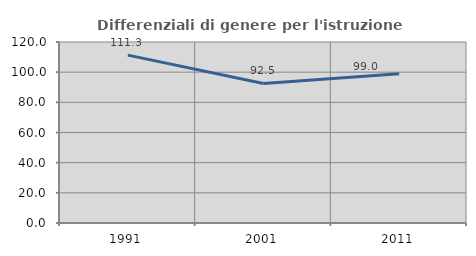
| Category | Differenziali di genere per l'istruzione superiore |
|---|---|
| 1991.0 | 111.308 |
| 2001.0 | 92.525 |
| 2011.0 | 98.952 |